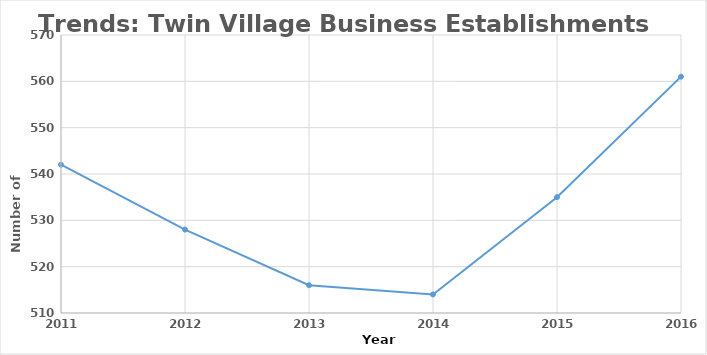
| Category | Establishments |
|---|---|
| 2016.0 | 561 |
| 2015.0 | 535 |
| 2014.0 | 514 |
| 2013.0 | 516 |
| 2012.0 | 528 |
| 2011.0 | 542 |